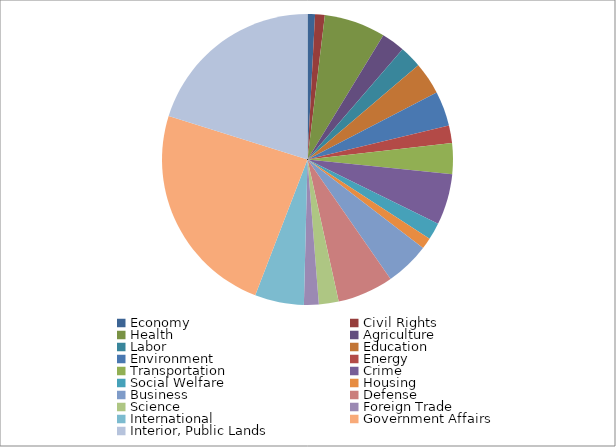
| Category | Series 0 |
|---|---|
| Economy | 0.829 |
| Civil Rights | 1.079 |
| Health | 6.821 |
| Agriculture | 2.601 |
| Labor | 2.447 |
| Education | 3.603 |
| Environment | 3.854 |
| Energy | 1.965 |
| Transportation | 3.41 |
| Crime | 5.665 |
| Social Welfare | 1.888 |
| Housing | 1.233 |
| Business | 4.933 |
| Defense | 6.224 |
| Science | 2.197 |
| Foreign Trade | 1.638 |
| International | 5.453 |
| Government Affairs | 23.988 |
| Interior, Public Lands | 20.154 |